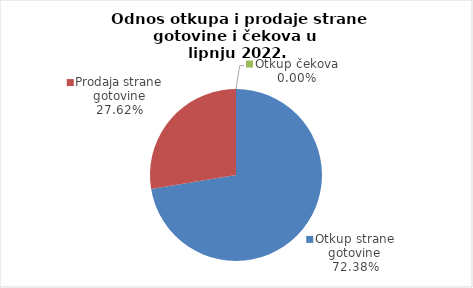
| Category | Series 0 |
|---|---|
| Otkup strane gotovine | 72.381 |
| Prodaja strane gotovine | 27.619 |
| Otkup čekova | 0 |